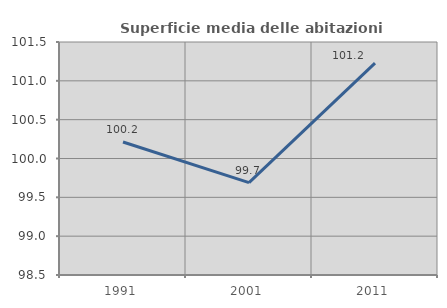
| Category | Superficie media delle abitazioni occupate |
|---|---|
| 1991.0 | 100.213 |
| 2001.0 | 99.689 |
| 2011.0 | 101.228 |